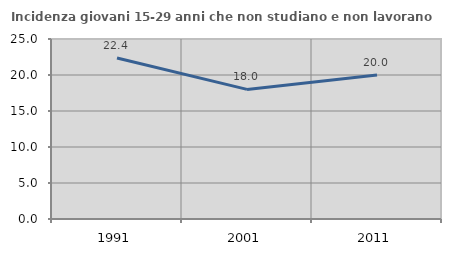
| Category | Incidenza giovani 15-29 anni che non studiano e non lavorano  |
|---|---|
| 1991.0 | 22.353 |
| 2001.0 | 18 |
| 2011.0 | 20 |